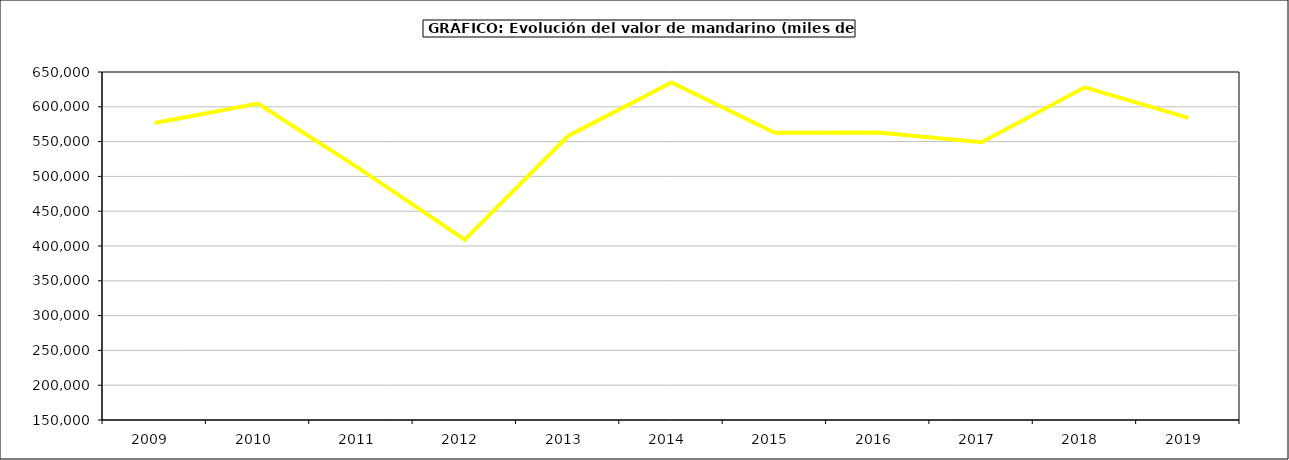
| Category | Valor |
|---|---|
| 2009.0 | 576642.957 |
| 2010.0 | 604584.128 |
| 2011.0 | 509378.831 |
| 2012.0 | 409245.656 |
| 2013.0 | 558087.419 |
| 2014.0 | 634994.836 |
| 2015.0 | 562627 |
| 2016.0 | 563122 |
| 2017.0 | 549191.426 |
| 2018.0 | 627958.978 |
| 2019.0 | 584094.488 |